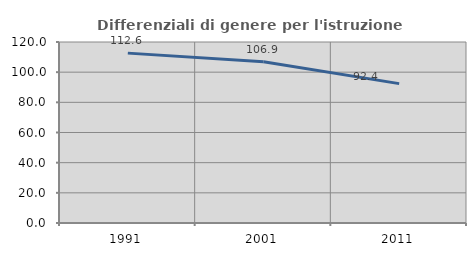
| Category | Differenziali di genere per l'istruzione superiore |
|---|---|
| 1991.0 | 112.626 |
| 2001.0 | 106.932 |
| 2011.0 | 92.395 |